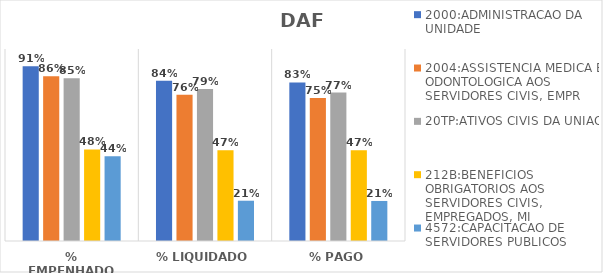
| Category | 2000:ADMINISTRACAO DA UNIDADE | 2004:ASSISTENCIA MEDICA E ODONTOLOGICA AOS SERVIDORES CIVIS, EMPR | 20TP:ATIVOS CIVIS DA UNIAO | 212B:BENEFICIOS OBRIGATORIOS AOS SERVIDORES CIVIS, EMPREGADOS, MI | 4572:CAPACITACAO DE SERVIDORES PUBLICOS FEDERAIS EM PROCESSO DE Q |
|---|---|---|---|---|---|
| % EMPENHADO | 0.911 | 0.858 | 0.848 | 0.477 | 0.442 |
| % LIQUIDADO | 0.835 | 0.762 | 0.792 | 0.473 | 0.21 |
| % PAGO | 0.826 | 0.745 | 0.773 | 0.473 | 0.209 |